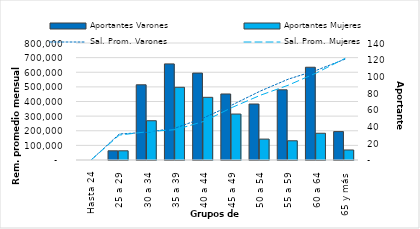
| Category | Aportantes Varones | Aportantes Mujeres |
|---|---|---|
| Hasta 24 | 0 | 0 |
| 25 a 29 | 11 | 11 |
| 30 a 34 | 90 | 47 |
| 35 a 39 | 115 | 87 |
| 40 a 44 | 104 | 75 |
| 45 a 49 | 79 | 55 |
| 50 a 54 | 67 | 25 |
| 55 a 59 | 84 | 23 |
| 60 a 64 | 111 | 32 |
| 65 y más | 34 | 12 |